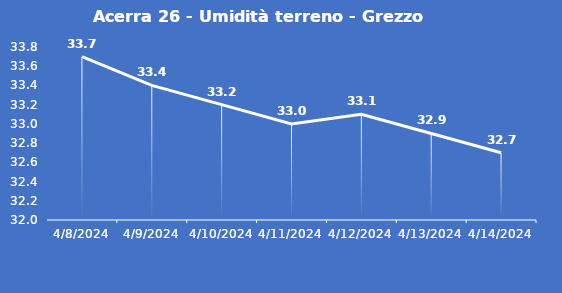
| Category | Acerra 26 - Umidità terreno - Grezzo (%VWC) |
|---|---|
| 4/8/24 | 33.7 |
| 4/9/24 | 33.4 |
| 4/10/24 | 33.2 |
| 4/11/24 | 33 |
| 4/12/24 | 33.1 |
| 4/13/24 | 32.9 |
| 4/14/24 | 32.7 |